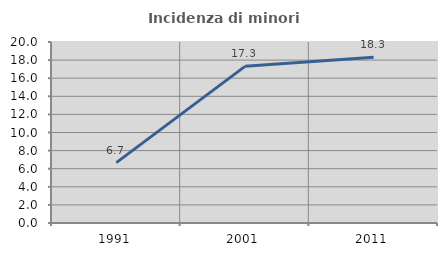
| Category | Incidenza di minori stranieri |
|---|---|
| 1991.0 | 6.667 |
| 2001.0 | 17.308 |
| 2011.0 | 18.302 |